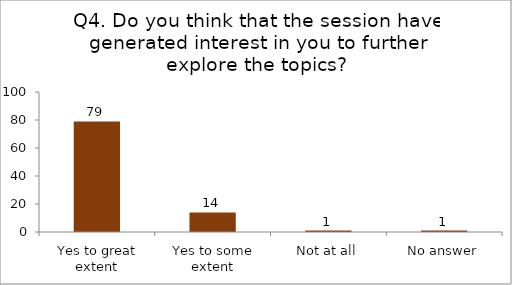
| Category | Q4. Do you think that the session have generated interest in you to further explore the topics? |
|---|---|
| Yes to great extent | 79 |
| Yes to some extent | 14 |
| Not at all | 1 |
| No answer | 1 |